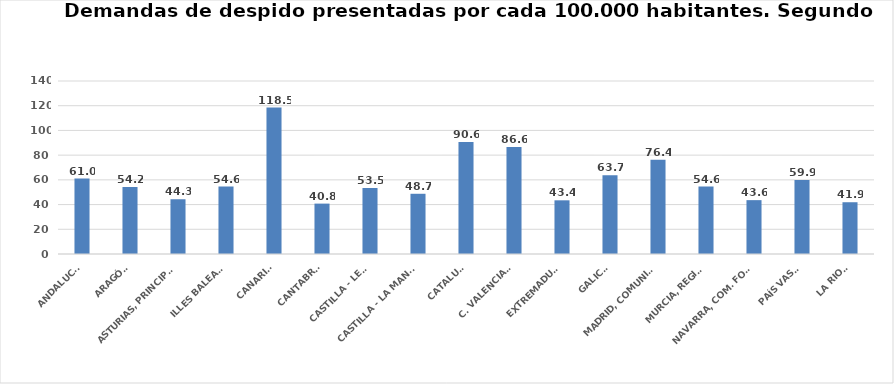
| Category | Series 0 |
|---|---|
| ANDALUCÍA | 61.017 |
| ARAGÓN | 54.175 |
| ASTURIAS, PRINCIPADO | 44.307 |
| ILLES BALEARS | 54.611 |
| CANARIAS | 118.532 |
| CANTABRIA | 40.78 |
| CASTILLA - LEÓN | 53.472 |
| CASTILLA - LA MANCHA | 48.735 |
| CATALUÑA | 90.644 |
| C. VALENCIANA | 86.561 |
| EXTREMADURA | 43.441 |
| GALICIA | 63.71 |
| MADRID, COMUNIDAD | 76.362 |
| MURCIA, REGIÓN | 54.615 |
| NAVARRA, COM. FORAL | 43.588 |
| PAÍS VASCO | 59.912 |
| LA RIOJA | 41.891 |